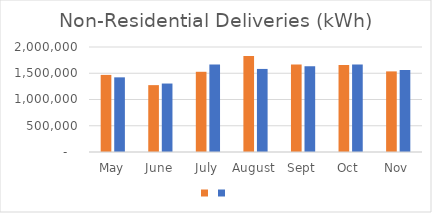
| Category | Series 1 | Series 0 |
|---|---|---|
| May | 1468470 | 1421957 |
| June | 1273660 | 1304116 |
| July | 1527956 | 1664865 |
| August | 1829758 | 1582276 |
| Sept | 1665239 | 1633351 |
| Oct  | 1657467 | 1665276 |
| Nov | 1535448 | 1561812 |